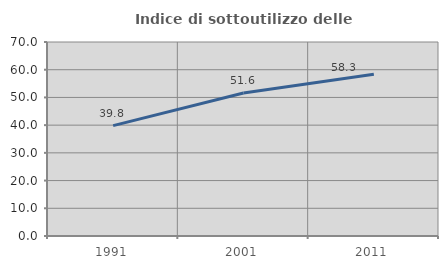
| Category | Indice di sottoutilizzo delle abitazioni  |
|---|---|
| 1991.0 | 39.837 |
| 2001.0 | 51.575 |
| 2011.0 | 58.333 |